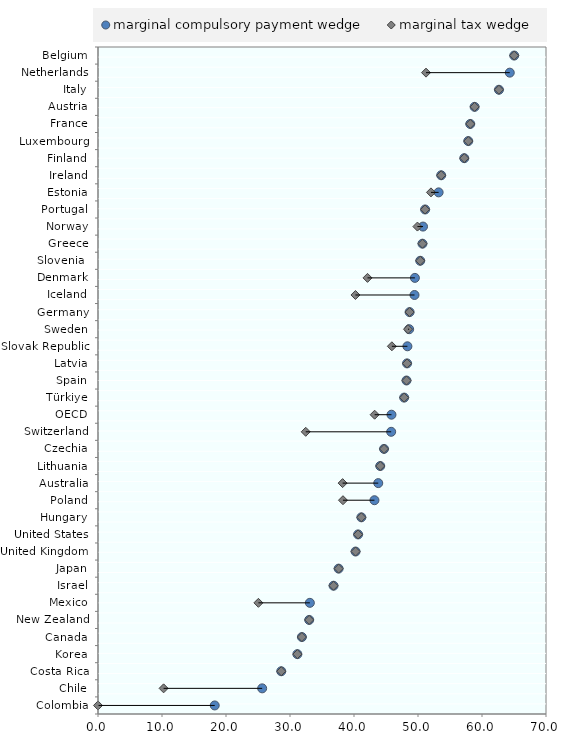
| Category | blankName |
|---|---|
| Colombia | 0 |
| Chile | 10.25 |
| Costa Rica | 28.633 |
| Korea | 31.151 |
| Canada | 31.858 |
| New Zealand | 33 |
| Mexico | 25.064 |
| Israel | 36.803 |
| Japan | 37.598 |
| United Kingdom | 40.246 |
| United States | 40.641 |
| Hungary | 41.15 |
| Poland | 38.278 |
| Australia | 38.221 |
| Lithuania | 44.101 |
| Czechia | 44.694 |
| Switzerland | 32.459 |
| OECD | 43.227 |
| Türkiye | 47.837 |
| Spain | 48.203 |
| Latvia | 48.291 |
| Slovak Republic | 45.917 |
| Sweden | 48.44 |
| Germany | 48.688 |
| Iceland | 40.228 |
| Denmark | 42.112 |
| Slovenia  | 50.348 |
| Greece | 50.698 |
| Norway | 49.912 |
| Portugal | 51.111 |
| Estonia | 52.028 |
| Ireland | 53.624 |
| Finland | 57.231 |
| Luxembourg | 57.854 |
| France | 58.166 |
| Austria | 58.845 |
| Italy | 62.648 |
| Netherlands | 51.253 |
| Belgium | 65.033 |